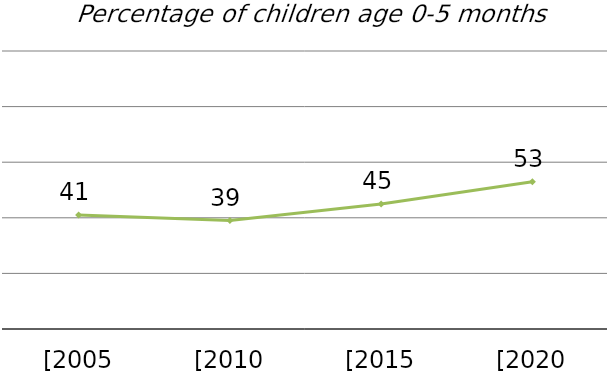
| Category | % of children 0-5 months who are exclusively breastfed |
|---|---|
| [2005 xDHS] | 41 |
| [2010 xDHS] | 39 |
| [2015 xDHS] | 45 |
| [2020 xDHS] | 53 |